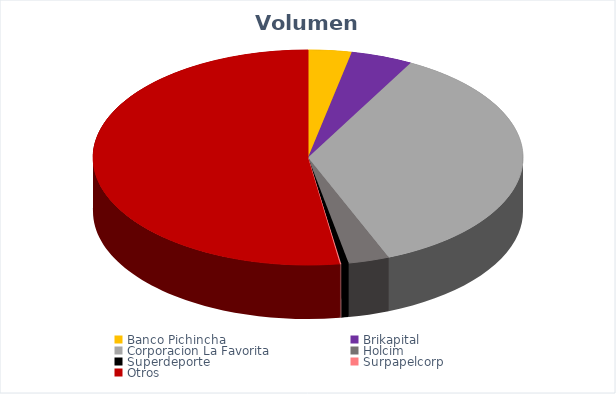
| Category | VOLUMEN ($USD) |
|---|---|
| Banco Pichincha | 2800 |
| Brikapital | 4000 |
| Corporacion La Favorita | 30909.64 |
| Holcim | 2660 |
| Superdeporte | 477.95 |
| Surpapelcorp | 85 |
| Otros | 45000 |